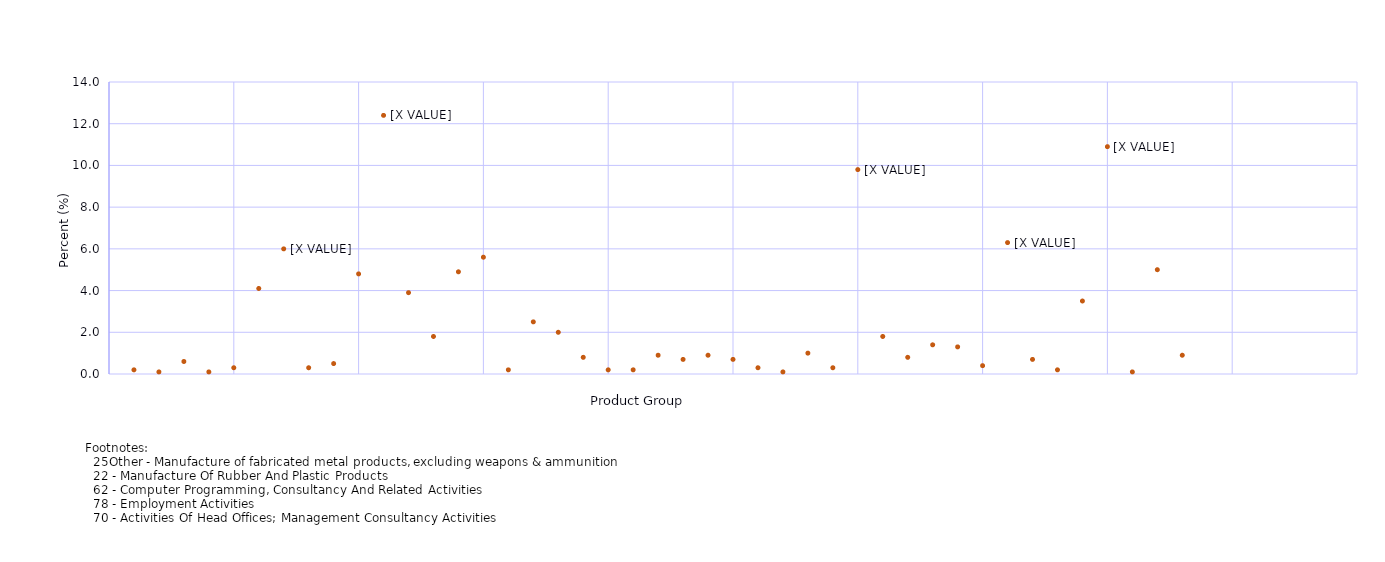
| Category | Percentage of intermediate consumption spent on products within industry 25.4 (excluding those with 0.0%) |
|---|---|
| 0 | 0.2 |
| 1 | 0.1 |
| 2 | 0.6 |
| 3 | 0.1 |
| 4 | 0.3 |
| 5 | 4.1 |
| 6 | 6 |
| 7 | 0.3 |
| 8 | 0.5 |
| 9 | 4.8 |
| 10 | 12.4 |
| 11 | 3.9 |
| 12 | 1.8 |
| 13 | 4.9 |
| 14 | 5.6 |
| 15 | 0.2 |
| 16 | 2.5 |
| 17 | 2 |
| 18 | 0.8 |
| 19 | 0.2 |
| 20 | 0.2 |
| 21 | 0.9 |
| 22 | 0.7 |
| 23 | 0.9 |
| 24 | 0.7 |
| 25 | 0.3 |
| 26 | 0.1 |
| 27 | 1 |
| 28 | 0.3 |
| 29 | 9.8 |
| 30 | 1.8 |
| 31 | 0.8 |
| 32 | 1.4 |
| 33 | 1.3 |
| 34 | 0.4 |
| 35 | 6.3 |
| 36 | 0.7 |
| 37 | 0.2 |
| 38 | 3.5 |
| 39 | 10.9 |
| 40 | 0.1 |
| 41 | 5 |
| 42 | 0.9 |